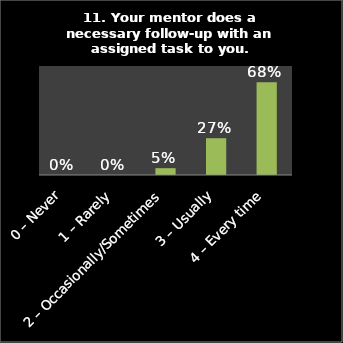
| Category | Series 0 |
|---|---|
| 0 – Never | 0 |
| 1 – Rarely | 0 |
| 2 – Occasionally/Sometimes | 0.05 |
| 3 – Usually | 0.27 |
| 4 – Every time | 0.68 |